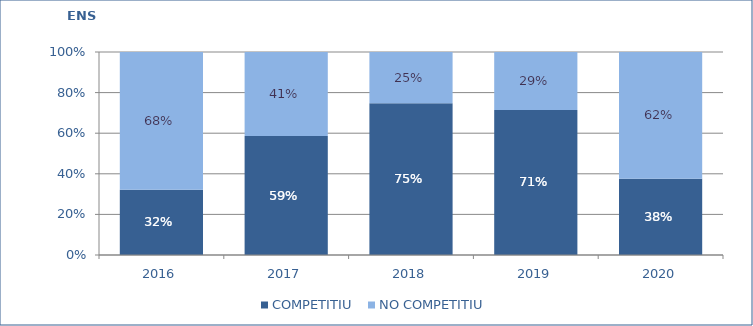
| Category | COMPETITIU  | NO COMPETITIU |
|---|---|---|
| 2016.0 | 0.321 | 0.679 |
| 2017.0 | 0.586 | 0.414 |
| 2018.0 | 0.748 | 0.252 |
| 2019.0 | 0.715 | 0.285 |
| 2020.0 | 0.376 | 0.624 |